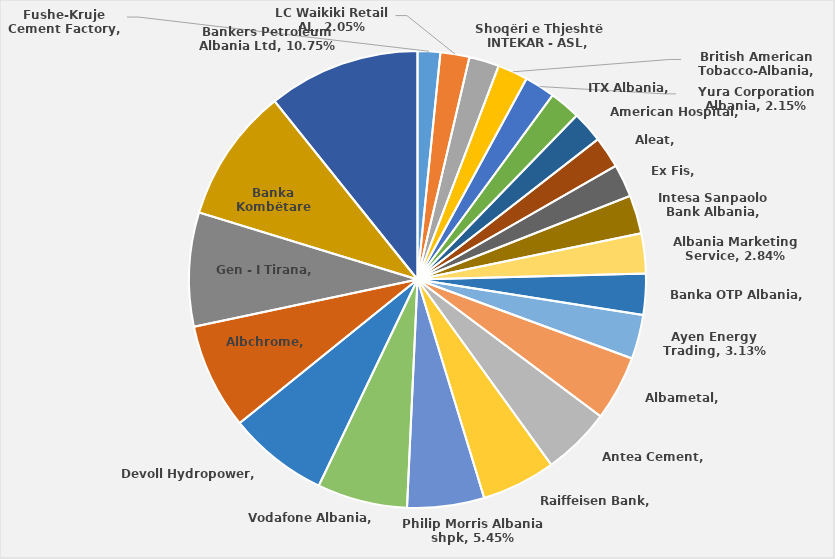
| Category | Të ardhura 2022
(në Lekë) |
|---|---|
| Fushe-Kruje Cement Factory | 4000000000 |
| LC Waikiki Retail AL | 5115555822 |
| Shoqëri e Thjeshtë INTEKAR - ASL | 5299351725 |
| British American Tobacco-Albania | 5335626498 |
| Yura Corporation Albania | 5365678864 |
| ITX Albania | 5482171000 |
| American Hospital | 5533331000 |
| Aleat | 5554972201 |
| Ex Fis | 5792772756 |
| Intesa Sanpaolo Bank Albania | 6777726000 |
| Albania Marketing Service | 7074191064 |
| Banka OTP Albania | 7239471000 |
| Ayen Energy Trading | 7802423415 |
| Albametal | 11474876424 |
| Antea Cement | 12056748000 |
| Raiffeisen Bank | 13062458000 |
| Philip Morris Albania shpk | 13584176000 |
| Vodafone Albania | 15911000000 |
| Devoll Hydropower | 17666392290 |
| Albchrome | 18680000000 |
| Gen - I Tirana | 20114011888 |
| Banka Kombëtare Tregtare | 23706242000 |
| Bankers Petroleum Albania Ltd | 26829000000 |